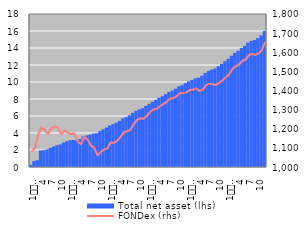
| Category | Total net asset (lhs) |
|---|---|
| 1
2007 | 0.249 |
| 2 | 0.705 |
| 3 | 0.801 |
| 4 | 1.949 |
| 5 | 1.984 |
| 6 | 2.07 |
| 7 | 2.261 |
| 8 | 2.422 |
| 9 | 2.563 |
| 10 | 2.653 |
| 11 | 2.867 |
| 12 | 3.046 |
| 1
2008 | 3.155 |
| 2 | 3.167 |
| 3 | 3.177 |
| 4 | 3.297 |
| 5 | 3.602 |
| 6 | 3.719 |
| 7 | 3.811 |
| 8 | 3.934 |
| 9 | 3.976 |
| 10 | 4.22 |
| 11 | 4.435 |
| 12 | 4.641 |
| 1
2009 | 4.903 |
| 2 | 5.027 |
| 3 | 5.204 |
| 4 | 5.43 |
| 5 | 5.714 |
| 6 | 5.882 |
| 7 | 6.078 |
| 8 | 6.364 |
| 9 | 6.611 |
| 10 | 6.792 |
| 11 | 6.912 |
| 12 | 7.188 |
| 1
2010 | 7.432 |
| 2 | 7.676 |
| 3 | 7.899 |
| 4 | 8.15 |
| 5 | 8.327 |
| 6 | 8.568 |
| 7 | 8.841 |
| 8 | 8.995 |
| 9 | 9.206 |
| 10 | 9.488 |
| 11 | 9.639 |
| 12 | 9.863 |
| 1
2011 | 10.082 |
| 2 | 10.238 |
| 3 | 10.435 |
| 4 | 10.51 |
| 5 | 10.725 |
| 6 | 11.067 |
| 7 | 11.306 |
| 8 | 11.45 |
| 9 | 11.587 |
| 10 | 11.853 |
| 11 | 12.123 |
| 12 | 12.452 |
| 1
2012 | 12.722 |
| 2 | 13.086 |
| 3 | 13.424 |
| 4 | 13.664 |
| 5 | 13.998 |
| 6 | 14.251 |
| 7 | 14.626 |
| 8 | 14.843 |
| 9 | 14.949 |
| 10 | 15.164 |
| 11 | 15.488 |
| 12 | 16.011 |